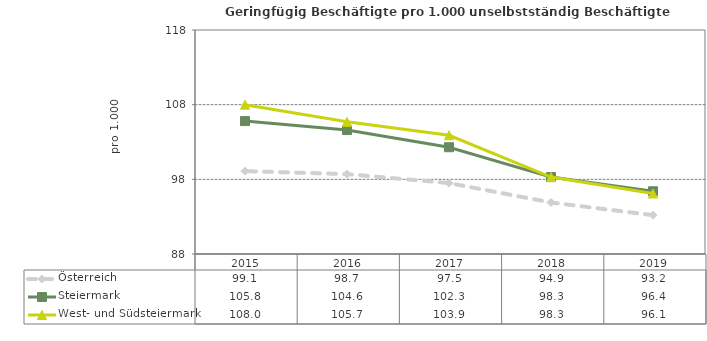
| Category | Österreich | Steiermark | West- und Südsteiermark |
|---|---|---|---|
| 2019.0 | 93.2 | 96.4 | 96.1 |
| 2018.0 | 94.9 | 98.3 | 98.3 |
| 2017.0 | 97.5 | 102.3 | 103.9 |
| 2016.0 | 98.7 | 104.6 | 105.7 |
| 2015.0 | 99.1 | 105.8 | 108 |